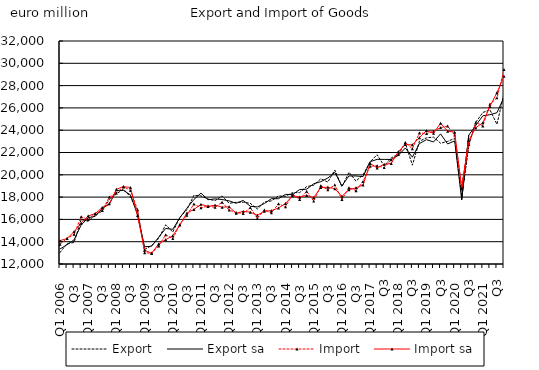
| Category | Export | Export sa | Import | Import sa |
|---|---|---|---|---|
| Q1 2006 | 13028.92 | 13350.288 | 13777.659 | 14093.674 |
| Q2  | 13828.521 | 13724.723 | 14285.651 | 14283.261 |
| Q3  | 13928.789 | 14171.508 | 14667.642 | 14904.911 |
| Q4  | 15982.056 | 15493.923 | 16237.501 | 15662.388 |
| Q1 2007 | 15837.224 | 16151.217 | 15983.893 | 16306.712 |
| Q2  | 16384.758 | 16276.772 | 16516.669 | 16519.484 |
| Q3  | 16752.711 | 16993.432 | 16806.82 | 17068.68 |
| Q4  | 17802.915 | 17365.548 | 18002.552 | 17408.854 |
| Q1 2008 | 18280.272 | 18601.257 | 18361.797 | 18702.231 |
| Q2  | 18722.829 | 18599.162 | 18934.852 | 18939.169 |
| Q3  | 18018.673 | 18197.554 | 18597.443 | 18864.152 |
| Q4  | 16752.341 | 16397.939 | 16875.943 | 16350.678 |
| Q1 2009 | 13304.857 | 13543.551 | 13008.509 | 13244.04 |
| Q2  | 13655.247 | 13593.991 | 12960.49 | 12964.04 |
| Q3  | 14290.256 | 14402.207 | 13623.001 | 13798.695 |
| Q4  | 15520.173 | 15188.578 | 14617.084 | 14186.717 |
| Q1 2010 | 14863.385 | 15108.756 | 14276.788 | 14536.041 |
| Q2  | 16185.815 | 16137.647 | 15519.386 | 15512.884 |
| Q3  | 16863.434 | 17002.273 | 16369.798 | 16564.466 |
| Q4  | 18154.87 | 17783.994 | 17377.176 | 16896.09 |
| Q1 2011 | 18106.557 | 18357.883 | 17045.05 | 17349.042 |
| Q2  | 17826.289 | 17767.308 | 17196.592 | 17166.721 |
| Q3  | 17683.872 | 17839.964 | 17079.335 | 17280.477 |
| Q4  | 18104.483 | 17784.148 | 17547.026 | 17095.289 |
| Q1 2012 | 17443.152 | 17658.646 | 16831.942 | 17129.693 |
| Q2  | 17533.442 | 17446.279 | 16614.351 | 16553.539 |
| Q3  | 17541.738 | 17702.134 | 16525.036 | 16721.135 |
| Q4  | 17442.248 | 17176.757 | 17056.592 | 16650.665 |
| Q1 2013 | 16927.336 | 17116.802 | 16086.94 | 16373.852 |
| Q2  | 17552.594 | 17427.555 | 16839.129 | 16737.4 |
| Q3  | 17664.522 | 17860.262 | 16585.752 | 16786.969 |
| Q4  | 18098.253 | 17854.687 | 17399.789 | 17021.555 |
| Q1 2014 | 18076.793 | 18241.856 | 17130.033 | 17434.488 |
| Q2  | 18403.164 | 18222.019 | 18261.264 | 18111.253 |
| Q3  | 18405.173 | 18674.228 | 17787.779 | 18006.318 |
| Q4  | 18941.252 | 18711.548 | 18522.121 | 18154.275 |
| Q1 2015 | 19059.068 | 19198.719 | 17645.281 | 17948.993 |
| Q2  | 19641.695 | 19383.64 | 19029.915 | 18852.695 |
| Q3  | 19347.904 | 19708.693 | 18651.483 | 18885.78 |
| Q4 | 20428.113 | 20208.008 | 19098.42 | 18750.159 |
| Q1 2016 | 18918.477 | 19006.269 | 17794.107 | 18065.681 |
| Q2  | 20229.907 | 19898.174 | 18847.316 | 18668.569 |
| Q3  | 19436.876 | 19896.998 | 18580.385 | 18832.362 |
| Q4 | 20002.902 | 19835.592 | 19408.098 | 19087.325 |
| Q1 2017 | 21163.116 | 21170.856 | 20761.165 | 21024.426 |
| Q2  | 21802.787 | 21383.785 | 20817.464 | 20616.394 |
| Q3 | 20794.89 | 21384.737 | 20647.277 | 20941.321 |
| Q4 | 21524.274 | 21373.476 | 21347.146 | 21014.88 |
| Q1 2018 | 21824.307 | 21738.989 | 21829.717 | 22076.589 |
| Q2  | 22843.595 | 22402.42 | 22906.362 | 22708.677 |
| Q3 | 20865.496 | 21576.983 | 22330.788 | 22684.809 |
| Q4 | 23010.183 | 22802.124 | 23756.711 | 23334.013 |
| Q1 2019 | 23315.703 | 23151.295 | 23699.585 | 23963.036 |
| Q2  | 23380.932 | 22943.877 | 23909.317 | 23717.811 |
| Q3 | 22831.355 | 23669.268 | 24235.731 | 24629.974 |
| Q4 | 22996.61 | 22768.272 | 24366.869 | 23905.735 |
| Q1 2020 | 23262.446 | 23043.336 | 23559.45 | 23824.486 |
| Q2  | 18079.547 | 17761.672 | 18921.757 | 18777.191 |
| Q3 | 22652.302 | 23553.389 | 22720.765 | 23107.084 |
| Q4 | 24715.548 | 24433.802 | 24706.301 | 24215.59 |
| Q1 2021 | 25588.773 | 25289.695 | 24387.035 | 24669.498 |
| Q2  | 25833.964 | 25389.13 | 26333.132 | 26133.808 |
| Q3 | 24529.653 | 25569.683 | 26900.857 | 27366.332 |
| Q4 | 27292.562 | 26955.169 | 29434.621 | 28828.659 |